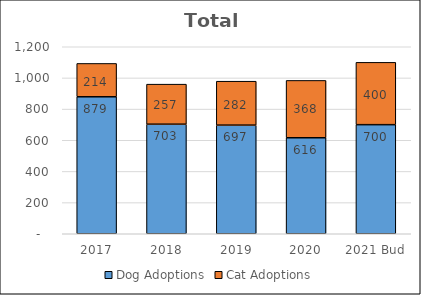
| Category | Dog Adoptions | Cat Adoptions |
|---|---|---|
| 2017 | 879 | 214 |
| 2018 | 703 | 257 |
| 2019 | 697 | 282 |
| 2020 | 616 | 368 |
| 2021 Bud | 700 | 400 |